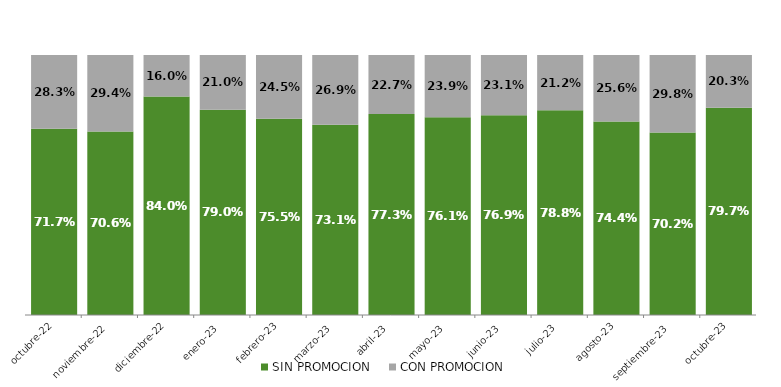
| Category | SIN PROMOCION   | CON PROMOCION   |
|---|---|---|
| 2022-10-01 | 0.717 | 0.283 |
| 2022-11-01 | 0.706 | 0.294 |
| 2022-12-01 | 0.84 | 0.16 |
| 2023-01-01 | 0.79 | 0.21 |
| 2023-02-01 | 0.755 | 0.245 |
| 2023-03-01 | 0.731 | 0.269 |
| 2023-04-01 | 0.773 | 0.227 |
| 2023-05-01 | 0.761 | 0.239 |
| 2023-06-01 | 0.769 | 0.231 |
| 2023-07-01 | 0.788 | 0.212 |
| 2023-08-01 | 0.744 | 0.256 |
| 2023-09-01 | 0.702 | 0.298 |
| 2023-10-01 | 0.797 | 0.203 |